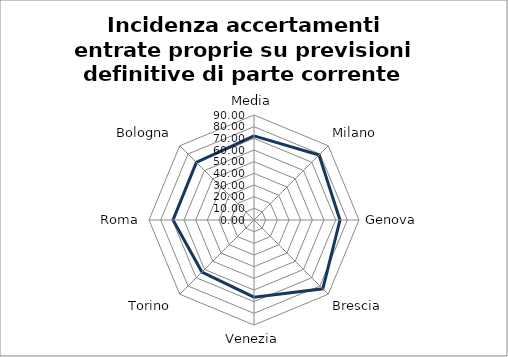
| Category | Incidenza accertamenti entrate proprie su previsioni definitive di parte corrente |
|---|---|
| Media | 72.064 |
| Milano | 78.84 |
| Genova | 73.7 |
| Brescia | 83.41 |
| Venezia | 66.13 |
| Torino | 63.1 |
| Roma | 69.4 |
| Bologna | 69.87 |